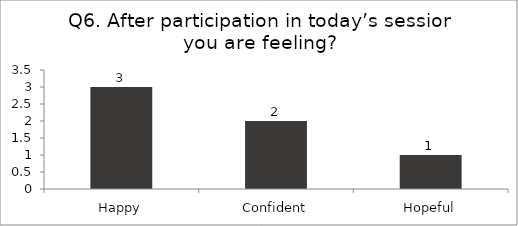
| Category | Q6. After participation in today’s session you are feeling? |
|---|---|
| Happy | 3 |
| Confident | 2 |
| Hopeful | 1 |